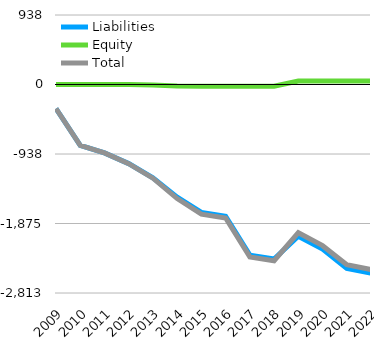
| Category | Liabilities  | Equity  | Total |
|---|---|---|---|
| 2009 | -325 | 0 | -325 |
| 2010 | -820 | 0 | -820 |
| 2011 | -923 | 0 | -923 |
| 2012 | -1067 | 0 | -1067 |
| 2013 | -1257.7 | -6.3 | -1264 |
| 2014 | -1518.7 | -20.3 | -1539 |
| 2015 | -1725.7 | -23.3 | -1749 |
| 2016 | -1777.7 | -23.3 | -1801 |
| 2017 | -2301.7 | -23.3 | -2325 |
| 2018 | -2353.7 | -23.3 | -2377 |
| 2019 | -2046.7 | 47.7 | -1999 |
| 2020 | -2220.7 | 46.7 | -2174 |
| 2021 | -2479.7 | 48 | -2431.7 |
| 2022 | -2544.3 | 48 | -2496.3 |